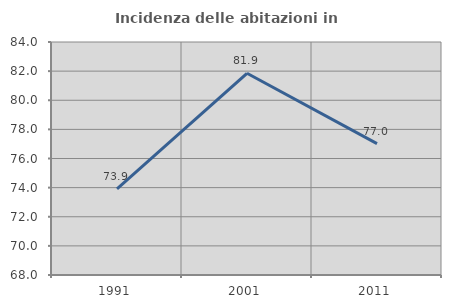
| Category | Incidenza delle abitazioni in proprietà  |
|---|---|
| 1991.0 | 73.913 |
| 2001.0 | 81.852 |
| 2011.0 | 77.021 |